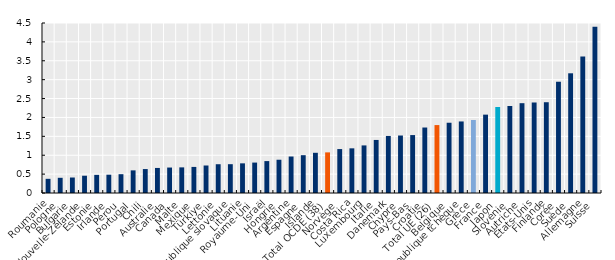
| Category | Series 0 |
|---|---|
| Roumanie | 0.375 |
| Pologne | 0.402 |
| Bulgarie | 0.41 |
| Nouvelle-Zélande | 0.457 |
| Estonie | 0.48 |
| Irlande | 0.484 |
| Pérou | 0.498 |
| Portugal | 0.599 |
| Chili | 0.634 |
| Australie | 0.663 |
| Canada | 0.674 |
| Malte | 0.678 |
| Mexique | 0.69 |
| Türkiye | 0.728 |
| Lettonie | 0.762 |
| République slovaque | 0.763 |
| Lituanie | 0.785 |
| Royaume-Uni | 0.805 |
| Israël | 0.845 |
| Hongrie | 0.881 |
| Argentine | 0.966 |
| Espagne | 1.001 |
| Islande | 1.064 |
| Total OCDE (38) | 1.075 |
| Norvège | 1.163 |
| Costa Rica | 1.182 |
| Luxembourg | 1.26 |
| Italie | 1.404 |
| Danemark | 1.51 |
| Chypre | 1.522 |
| Pays-Bas | 1.533 |
| Croatie | 1.733 |
| Total UE (26) | 1.798 |
| Belgique | 1.86 |
| République tchèque | 1.894 |
| Grèce | 1.933 |
| France | 2.074 |
| Japon | 2.276 |
| Slovénie | 2.303 |
| Autriche | 2.377 |
| États-Unis | 2.396 |
| Finlande | 2.403 |
| Corée | 2.945 |
| Suède | 3.169 |
| Allemagne | 3.614 |
| Suisse | 4.398 |